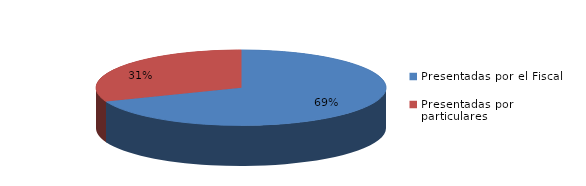
| Category | Series 0 |
|---|---|
| Presentadas por el Fiscal | 789 |
| Presentadas por particulares | 354 |